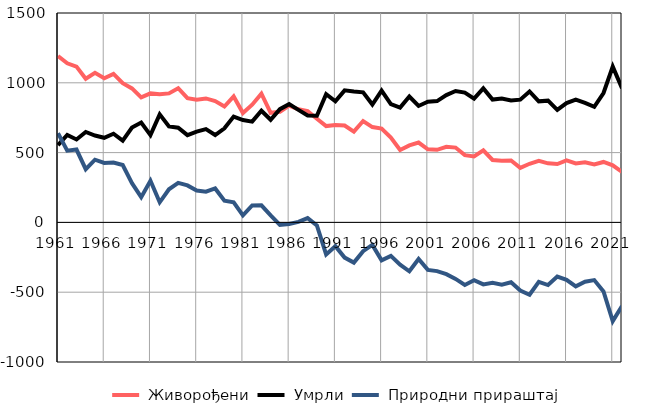
| Category |  Живорођени |  Умрли |  Природни прираштај |
|---|---|---|---|
| 1961.0 | 1192 | 553 | 639 |
| 1962.0 | 1140 | 626 | 514 |
| 1963.0 | 1116 | 594 | 522 |
| 1964.0 | 1029 | 648 | 381 |
| 1965.0 | 1071 | 622 | 449 |
| 1966.0 | 1032 | 606 | 426 |
| 1967.0 | 1064 | 635 | 429 |
| 1968.0 | 997 | 586 | 411 |
| 1969.0 | 960 | 679 | 281 |
| 1970.0 | 896 | 715 | 181 |
| 1971.0 | 924 | 625 | 299 |
| 1972.0 | 918 | 774 | 144 |
| 1973.0 | 924 | 687 | 237 |
| 1974.0 | 961 | 678 | 283 |
| 1975.0 | 890 | 625 | 265 |
| 1976.0 | 878 | 650 | 228 |
| 1977.0 | 888 | 668 | 220 |
| 1978.0 | 869 | 626 | 243 |
| 1979.0 | 830 | 674 | 156 |
| 1980.0 | 902 | 758 | 144 |
| 1981.0 | 783 | 733 | 50 |
| 1982.0 | 843 | 722 | 121 |
| 1983.0 | 922 | 800 | 122 |
| 1984.0 | 785 | 735 | 50 |
| 1985.0 | 793 | 811 | -18 |
| 1986.0 | 836 | 847 | -11 |
| 1987.0 | 810 | 806 | 4 |
| 1988.0 | 797 | 766 | 31 |
| 1989.0 | 743 | 764 | -21 |
| 1990.0 | 690 | 919 | -229 |
| 1991.0 | 698 | 868 | -170 |
| 1992.0 | 694 | 946 | -252 |
| 1993.0 | 650 | 938 | -288 |
| 1994.0 | 726 | 932 | -206 |
| 1995.0 | 683 | 844 | -161 |
| 1996.0 | 672 | 944 | -272 |
| 1997.0 | 608 | 848 | -240 |
| 1998.0 | 519 | 822 | -303 |
| 1999.0 | 552 | 902 | -350 |
| 2000.0 | 572 | 834 | -262 |
| 2001.0 | 524 | 864 | -340 |
| 2002.0 | 520 | 869 | -349 |
| 2003.0 | 541 | 912 | -371 |
| 2004.0 | 536 | 941 | -405 |
| 2005.0 | 482 | 930 | -448 |
| 2006.0 | 473 | 887 | -414 |
| 2007.0 | 516 | 960 | -444 |
| 2008.0 | 447 | 880 | -433 |
| 2009.0 | 441 | 887 | -446 |
| 2010.0 | 444 | 873 | -429 |
| 2011.0 | 391 | 879 | -488 |
| 2012.0 | 420 | 938 | -518 |
| 2013.0 | 441 | 867 | -426 |
| 2014.0 | 423 | 872 | -449 |
| 2015.0 | 418 | 806 | -388 |
| 2016.0 | 444 | 855 | -411 |
| 2017.0 | 422 | 880 | -458 |
| 2018.0 | 431 | 856 | -425 |
| 2019.0 | 415 | 828 | -413 |
| 2020.0 | 433 | 927 | -494 |
| 2021.0 | 409 | 1116 | -707 |
| 2022.0 | 362 | 961 | -599 |